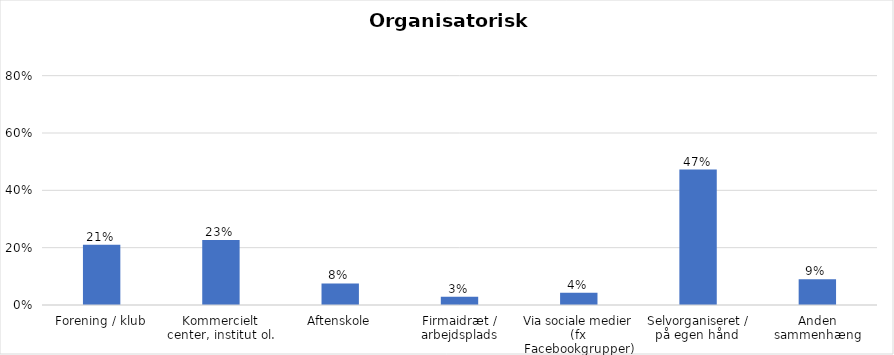
| Category | % |
|---|---|
| Forening / klub | 0.21 |
| Kommercielt center, institut ol. | 0.227 |
| Aftenskole | 0.075 |
| Firmaidræt / arbejdsplads | 0.029 |
| Via sociale medier (fx Facebookgrupper) | 0.043 |
| Selvorganiseret / på egen hånd  | 0.472 |
| Anden sammenhæng | 0.09 |